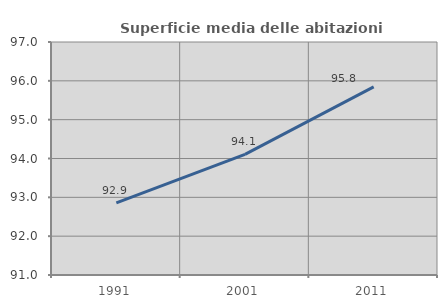
| Category | Superficie media delle abitazioni occupate |
|---|---|
| 1991.0 | 92.857 |
| 2001.0 | 94.108 |
| 2011.0 | 95.846 |